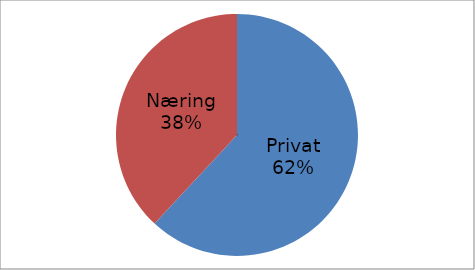
| Category | Series 0 |
|---|---|
| Privat | 34275435 |
| Næring | 21076889 |